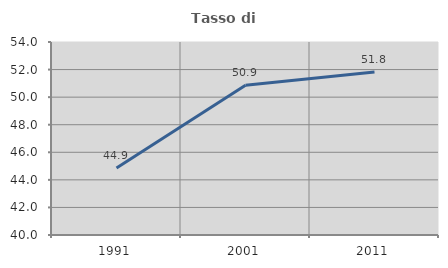
| Category | Tasso di occupazione   |
|---|---|
| 1991.0 | 44.858 |
| 2001.0 | 50.869 |
| 2011.0 | 51.831 |